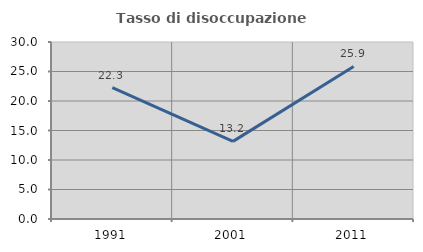
| Category | Tasso di disoccupazione giovanile  |
|---|---|
| 1991.0 | 22.275 |
| 2001.0 | 13.158 |
| 2011.0 | 25.862 |